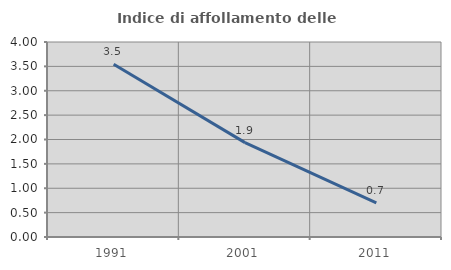
| Category | Indice di affollamento delle abitazioni  |
|---|---|
| 1991.0 | 3.543 |
| 2001.0 | 1.937 |
| 2011.0 | 0.701 |